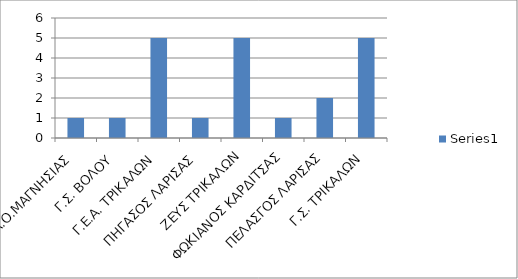
| Category | Series 0 |
|---|---|
| Α.Ο.ΜΑΓΝΗΣΙΑΣ | 1 |
| Γ.Σ. ΒΟΛΟΥ | 1 |
| Γ.Ε.Α. ΤΡΙΚΑΛΩΝ | 5 |
| ΠΗΓΑΣΟΣ ΛΑΡΙΣΑΣ | 1 |
| ΖΕΥΣ ΤΡΙΚΑΛΩΝ | 5 |
| ΦΩΚΙΑΝΟΣ ΚΑΡΔΙΤΣΑΣ | 1 |
| ΠΕΛΑΣΓΟΣ ΛΑΡΙΣΑΣ | 2 |
| Γ.Σ. ΤΡΙΚΑΛΩΝ | 5 |